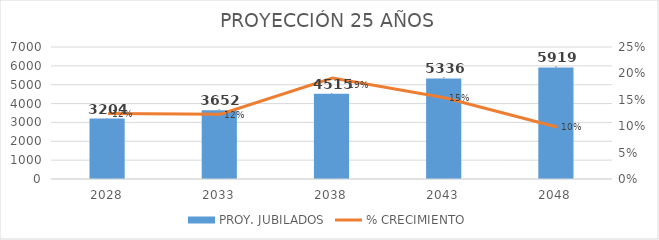
| Category | PROY. JUBILADOS |
|---|---|
| 2028.0 | 3204 |
| 2033.0 | 3652 |
| 2038.0 | 4515 |
| 2043.0 | 5336 |
| 2048.0 | 5919 |